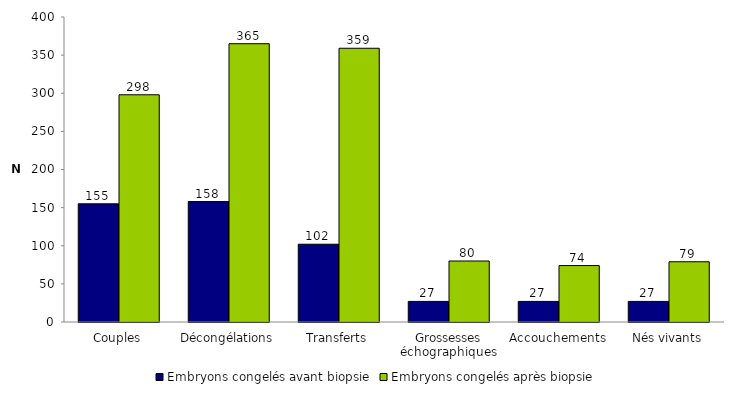
| Category | Embryons congelés avant biopsie | Embryons congelés après biopsie |
|---|---|---|
| Couples | 155 | 298 |
| Décongélations | 158 | 365 |
| Transferts | 102 | 359 |
| Grossesses échographiques | 27 | 80 |
| Accouchements | 27 | 74 |
| Nés vivants | 27 | 79 |